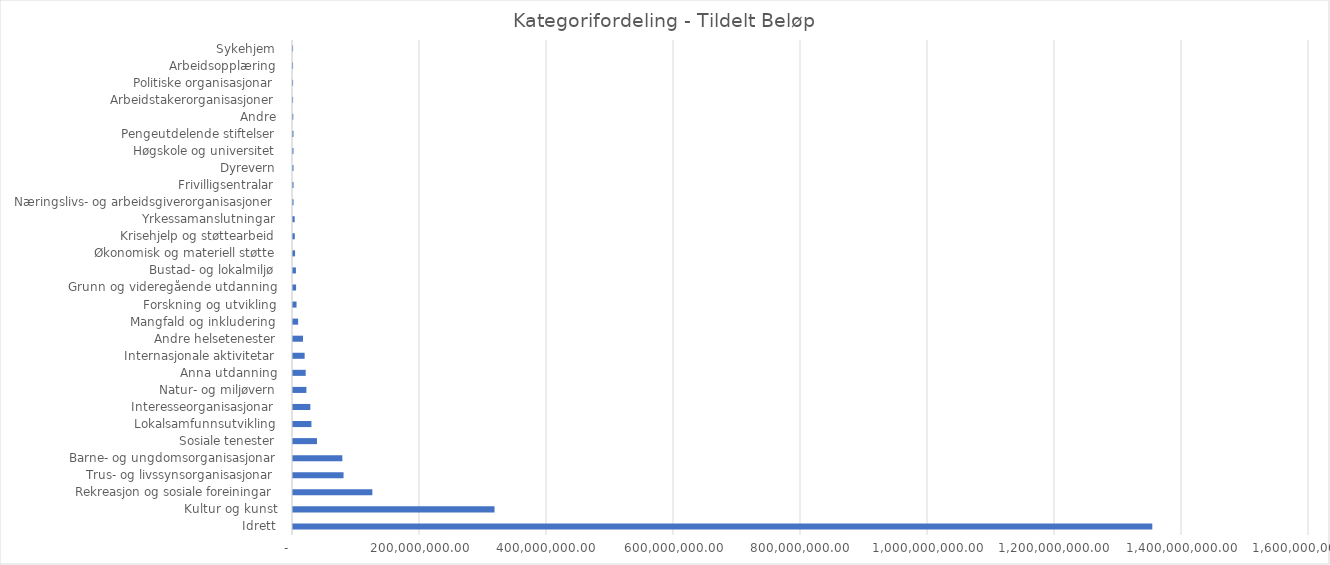
| Category | Tildelt Beløp |
|---|---|
|  Idrett  | 1353237601.7 |
|  Kultur og kunst  | 317365366.1 |
|  Rekreasjon og sosiale foreiningar  | 124935668.1 |
|  Trus- og livssynsorganisasjonar  | 79595912 |
|  Barne- og ungdomsorganisasjonar  | 77690671.3 |
|  Sosiale tenester  | 37741229 |
|  Lokalsamfunnsutvikling  | 29019003.7 |
|  Interesseorganisasjonar  | 27313910 |
|  Natur- og miljøvern  | 21110776 |
|  Anna utdanning  | 20000502 |
|  Internasjonale aktivitetar  | 18308476 |
|  Andre helsetenester  | 15742523 |
|  Mangfald og inkludering  | 8089375 |
|  Forskning og utvikling  | 5555539.1 |
|  Grunn og videregående utdanning  | 4874134 |
|  Bustad- og lokalmiljø  | 4616567 |
|  Økonomisk og materiell støtte  | 3247853 |
|  Krisehjelp og støttearbeid  | 2853242 |
|  Yrkessamanslutningar  | 2610257 |
|  Næringslivs- og arbeidsgiverorganisasjoner  | 870100 |
|  Frivilligsentralar  | 846044 |
|  Dyrevern  | 769174 |
|  Høgskole og universitet  | 754781 |
|  Pengeutdelende stiftelser  | 741190 |
|  Andre  | 447057 |
|  Arbeidstakerorganisasjoner  | 129150 |
|  Politiske organisasjonar  | 117055 |
|  Arbeidsopplæring  | 114930 |
|  Sykehjem  | 106270 |